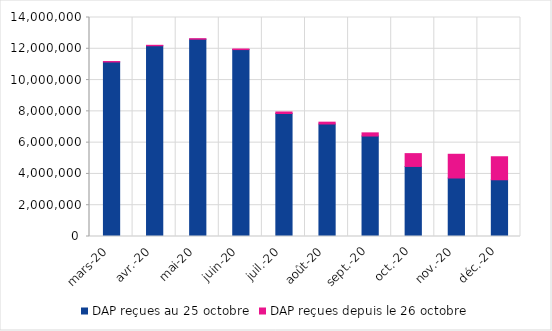
| Category | DAP reçues au 25 octobre | DAP reçues depuis le 26 octobre |
|---|---|---|
| 2020-03-01 | 11156891 | 26411 |
| 2020-04-01 | 12194372 | 27829 |
| 2020-05-01 | 12613161 | 31505 |
| 2020-06-01 | 11949173 | 37746 |
| 2020-07-01 | 7863445 | 95916 |
| 2020-08-01 | 7192864 | 116027 |
| 2020-09-01 | 6422456 | 202839 |
| 2020-10-01 | 4478656 | 819420 |
| 2020-11-01 | 3739706 | 1516679 |
| 2020-12-01 | 3626194 | 1471695 |